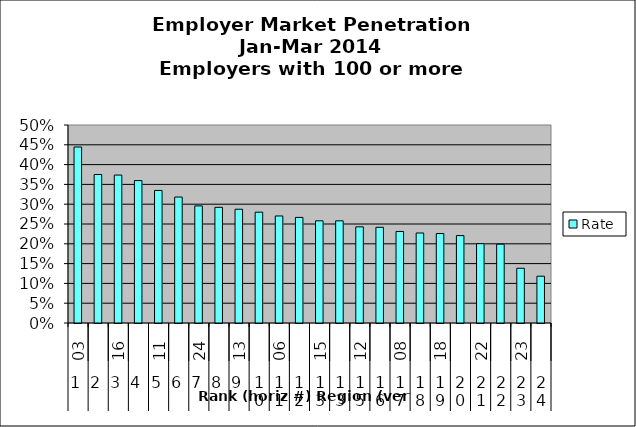
| Category | Rate |
|---|---|
| 0 | 0.444 |
| 1 | 0.375 |
| 2 | 0.374 |
| 3 | 0.36 |
| 4 | 0.335 |
| 5 | 0.318 |
| 6 | 0.296 |
| 7 | 0.292 |
| 8 | 0.287 |
| 9 | 0.28 |
| 10 | 0.27 |
| 11 | 0.267 |
| 12 | 0.258 |
| 13 | 0.258 |
| 14 | 0.243 |
| 15 | 0.242 |
| 16 | 0.231 |
| 17 | 0.227 |
| 18 | 0.226 |
| 19 | 0.221 |
| 20 | 0.2 |
| 21 | 0.199 |
| 22 | 0.138 |
| 23 | 0.118 |